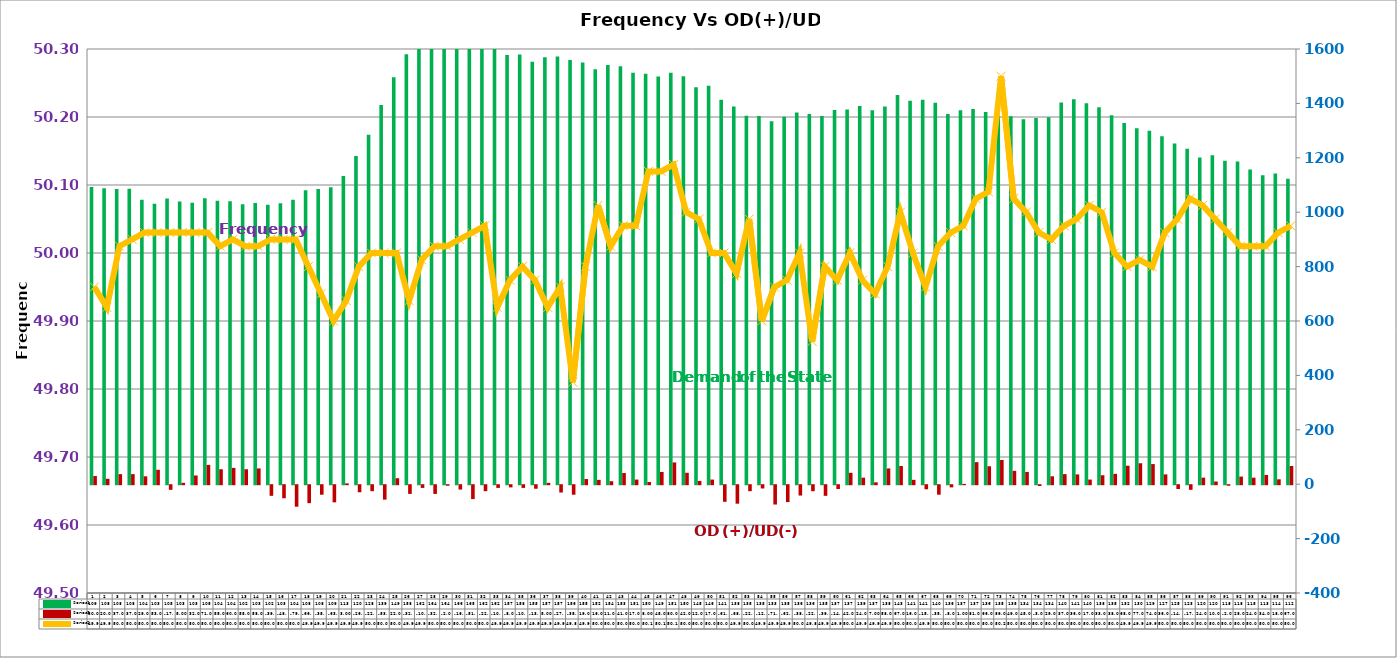
| Category | Series 2 | Series 4 |
|---|---|---|
| 0 | 1093 | 30 |
| 1 | 1088 | 20 |
| 2 | 1085 | 37 |
| 3 | 1086 | 37 |
| 4 | 1046 | 29 |
| 5 | 1031 | 53 |
| 6 | 1050 | -17 |
| 7 | 1039 | 5 |
| 8 | 1035 | 32 |
| 9 | 1051 | 71 |
| 10 | 1042 | 55 |
| 11 | 1040 | 60 |
| 12 | 1029 | 55 |
| 13 | 1034 | 58 |
| 14 | 1027 | -39 |
| 15 | 1033 | -48 |
| 16 | 1046 | -79 |
| 17 | 1081 | -66 |
| 18 | 1085 | -35 |
| 19 | 1092 | -63 |
| 20 | 1133 | 3 |
| 21 | 1207 | -26 |
| 22 | 1285 | -22 |
| 23 | 1394 | -53 |
| 24 | 1496 | 22 |
| 25 | 1581 | -32 |
| 26 | 1623 | -10 |
| 27 | 1644 | -32 |
| 28 | 1640 | -2 |
| 29 | 1662 | -16 |
| 30 | 1651 | -51 |
| 31 | 1622 | -22 |
| 32 | 1624 | -10 |
| 33 | 1578 | -8 |
| 34 | 1580 | -10 |
| 35 | 1553 | -13 |
| 36 | 1570 | 5 |
| 37 | 1572 | -27 |
| 38 | 1560 | -35 |
| 39 | 1550 | 19 |
| 40 | 1526 | 16 |
| 41 | 1541 | 11 |
| 42 | 1537 | 41 |
| 43 | 1513 | 17 |
| 44 | 1509 | 8 |
| 45 | 1499 | 45 |
| 46 | 1513 | 80 |
| 47 | 1500 | 42 |
| 48 | 1459 | 12 |
| 49 | 1465 | 17 |
| 50 | 1413 | -61 |
| 51 | 1389 | -68 |
| 52 | 1355 | -22 |
| 53 | 1354 | -12 |
| 54 | 1334 | -71 |
| 55 | 1351 | -62 |
| 56 | 1367 | -38 |
| 57 | 1361 | -22 |
| 58 | 1354 | -39 |
| 59 | 1376 | -14 |
| 60 | 1378 | 42 |
| 61 | 1390 | 24 |
| 62 | 1375 | 7 |
| 63 | 1389 | 58 |
| 64 | 1431 | 67 |
| 65 | 1410 | 16 |
| 66 | 1413 | -15 |
| 67 | 1402 | -35 |
| 68 | 1361 | -8 |
| 69 | 1375 | 1 |
| 70 | 1379 | 81 |
| 71 | 1368 | 66 |
| 72 | 1356 | 89 |
| 73 | 1353 | 49 |
| 74 | 1342 | 45 |
| 75 | 1346 | -3 |
| 76 | 1349 | 29 |
| 77 | 1403 | 37 |
| 78 | 1415 | 36 |
| 79 | 1401 | 17 |
| 80 | 1386 | 33 |
| 81 | 1356 | 38 |
| 82 | 1328 | 68 |
| 83 | 1309 | 77 |
| 84 | 1299 | 74 |
| 85 | 1279 | 36 |
| 86 | 1253 | -14 |
| 87 | 1233 | -17 |
| 88 | 1201 | 24 |
| 89 | 1209 | 10 |
| 90 | 1189 | -2 |
| 91 | 1186 | 28 |
| 92 | 1157 | 24 |
| 93 | 1136 | 34 |
| 94 | 1142 | 18 |
| 95 | 1123 | 67 |